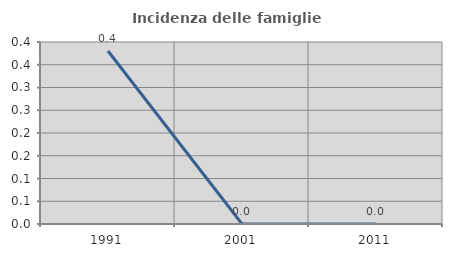
| Category | Incidenza delle famiglie numerose |
|---|---|
| 1991.0 | 0.38 |
| 2001.0 | 0 |
| 2011.0 | 0 |